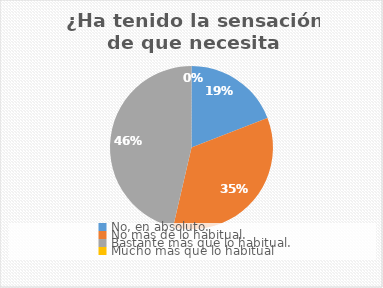
| Category | 2 |
|---|---|
| No, en absoluto. | 21 |
| No más de lo habitual. | 38 |
| Bastante más que lo habitual. | 51 |
| Mucho más que lo habitual | 0 |